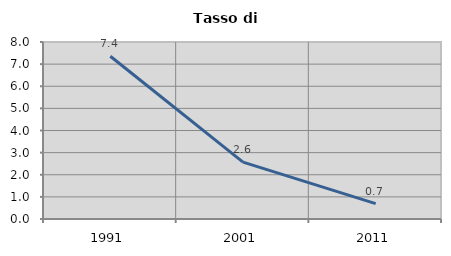
| Category | Tasso di disoccupazione   |
|---|---|
| 1991.0 | 7.358 |
| 2001.0 | 2.574 |
| 2011.0 | 0.697 |